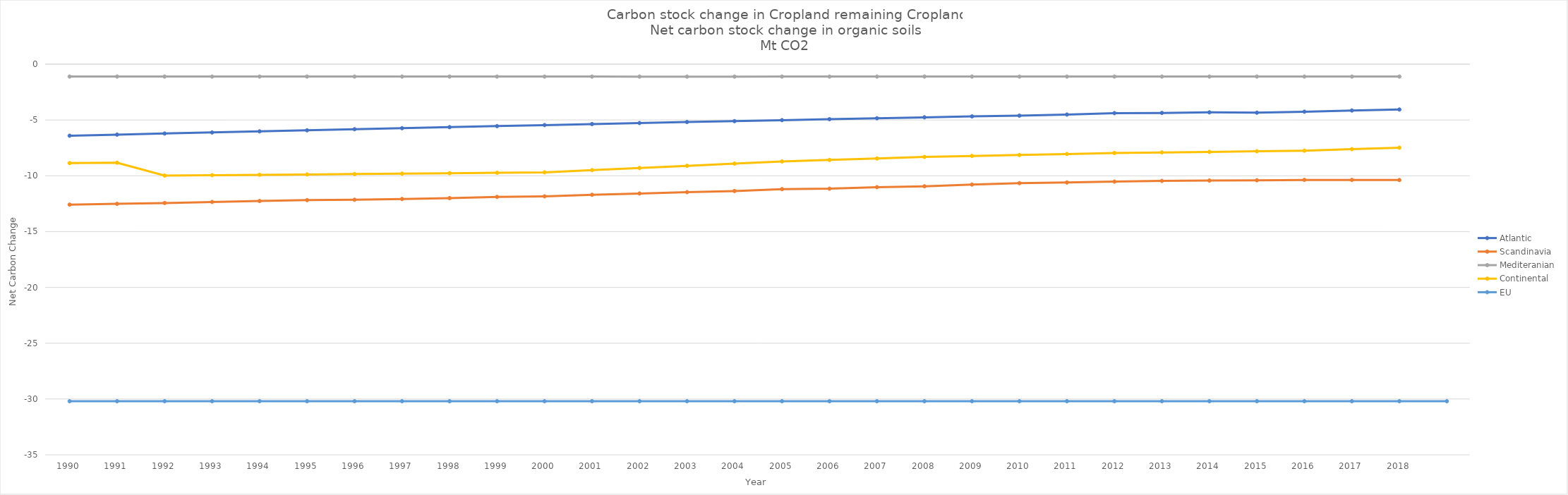
| Category | Atlantic | Scandinavia | Mediteranian | Continental | EU |
|---|---|---|---|---|---|
| 1990 | -6.41 | -12.585 | -1.111 | -8.863 | -30.198 |
| 1991 | -6.312 | -12.517 | -1.111 | -8.83 | -30.198 |
| 1992 | -6.214 | -12.439 | -1.111 | -9.981 | -30.198 |
| 1993 | -6.118 | -12.345 | -1.111 | -9.948 | -30.198 |
| 1994 | -6.021 | -12.263 | -1.111 | -9.914 | -30.198 |
| 1995 | -5.926 | -12.18 | -1.111 | -9.88 | -30.198 |
| 1996 | -5.831 | -12.149 | -1.111 | -9.844 | -30.198 |
| 1997 | -5.737 | -12.08 | -1.111 | -9.808 | -30.198 |
| 1998 | -5.643 | -12.003 | -1.111 | -9.77 | -30.198 |
| 1999 | -5.55 | -11.894 | -1.111 | -9.732 | -30.198 |
| 2000 | -5.458 | -11.842 | -1.111 | -9.692 | -30.198 |
| 2001 | -5.366 | -11.703 | -1.113 | -9.494 | -30.198 |
| 2002 | -5.275 | -11.587 | -1.114 | -9.301 | -30.198 |
| 2003 | -5.185 | -11.468 | -1.114 | -9.108 | -30.198 |
| 2004 | -5.104 | -11.364 | -1.114 | -8.911 | -30.198 |
| 2005 | -5.017 | -11.197 | -1.113 | -8.715 | -30.198 |
| 2006 | -4.931 | -11.156 | -1.113 | -8.58 | -30.198 |
| 2007 | -4.846 | -11.021 | -1.111 | -8.452 | -30.198 |
| 2008 | -4.762 | -10.943 | -1.111 | -8.312 | -30.198 |
| 2009 | -4.681 | -10.785 | -1.111 | -8.224 | -30.198 |
| 2010 | -4.612 | -10.659 | -1.111 | -8.138 | -30.198 |
| 2011 | -4.514 | -10.6 | -1.111 | -8.049 | -30.198 |
| 2012 | -4.388 | -10.521 | -1.111 | -7.957 | -30.197 |
| 2013 | -4.371 | -10.459 | -1.111 | -7.908 | -30.197 |
| 2014 | -4.319 | -10.428 | -1.111 | -7.86 | -30.198 |
| 2015 | -4.345 | -10.401 | -1.111 | -7.804 | -30.198 |
| 2016 | -4.258 | -10.369 | -1.111 | -7.75 | -30.197 |
| 2017 | -4.15 | -10.373 | -1.111 | -7.615 | -30.197 |
| 2018 | -4.062 | -10.382 | -1.111 | -7.482 | -30.197 |